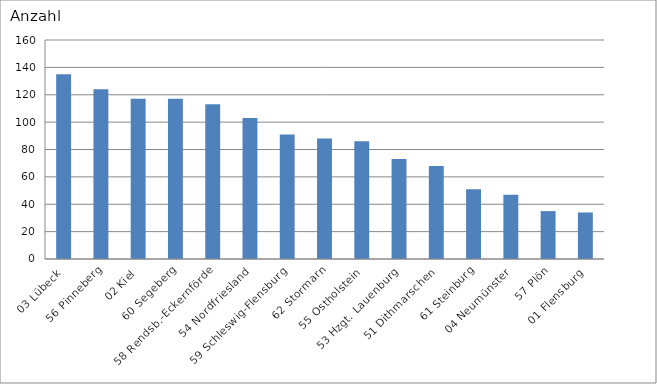
| Category | 03 Lübeck 56 Pinneberg 02 Kiel 60 Segeberg 58 Rendsb.-Eckernförde 54 Nordfriesland 59 Schleswig-Flensburg 62 Stormarn 55 Ostholstein 53 Hzgt. Lauenburg 51 Dithmarschen 61 Steinburg 04 Neumünster 57 Plön 01 Flensburg |
|---|---|
| 03 Lübeck | 135 |
| 56 Pinneberg | 124 |
| 02 Kiel | 117 |
| 60 Segeberg | 117 |
| 58 Rendsb.-Eckernförde | 113 |
| 54 Nordfriesland | 103 |
| 59 Schleswig-Flensburg | 91 |
| 62 Stormarn | 88 |
| 55 Ostholstein | 86 |
| 53 Hzgt. Lauenburg | 73 |
| 51 Dithmarschen | 68 |
| 61 Steinburg | 51 |
| 04 Neumünster | 47 |
| 57 Plön | 35 |
| 01 Flensburg | 34 |